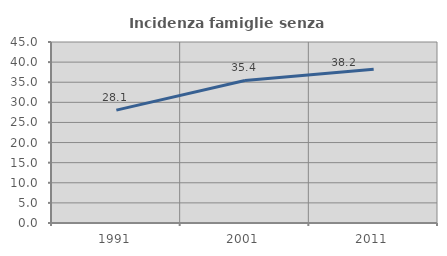
| Category | Incidenza famiglie senza nuclei |
|---|---|
| 1991.0 | 28.058 |
| 2001.0 | 35.448 |
| 2011.0 | 38.235 |